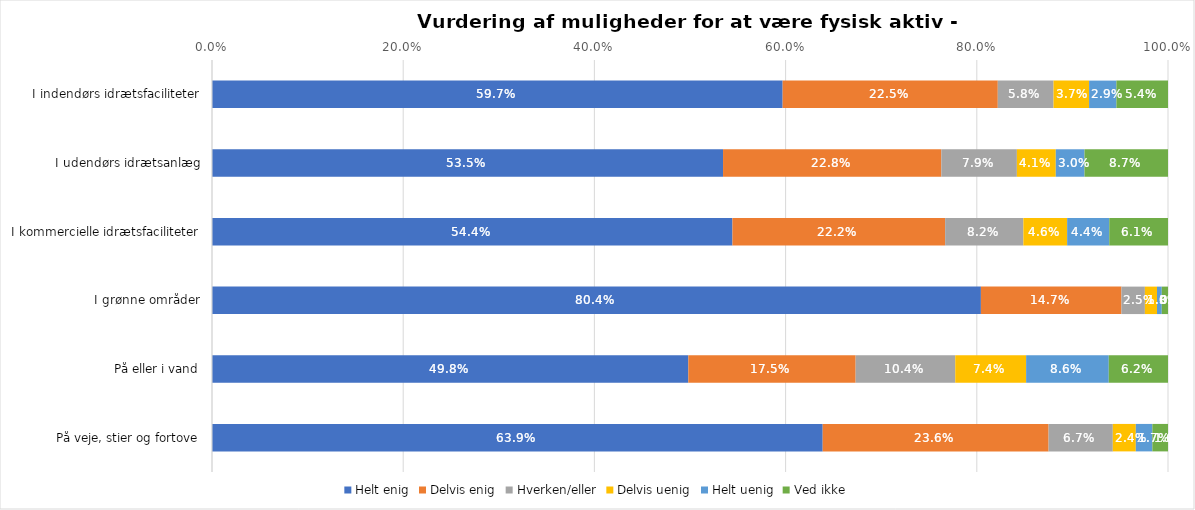
| Category | Helt enig | Delvis enig | Hverken/eller | Delvis uenig | Helt uenig | Ved ikke |
|---|---|---|---|---|---|---|
| I indendørs idrætsfaciliteter | 0.597 | 0.225 | 0.058 | 0.037 | 0.029 | 0.054 |
| I udendørs idrætsanlæg | 0.535 | 0.228 | 0.079 | 0.041 | 0.03 | 0.087 |
| I kommercielle idrætsfaciliteter | 0.544 | 0.222 | 0.082 | 0.046 | 0.044 | 0.061 |
| I grønne områder | 0.804 | 0.147 | 0.025 | 0.013 | 0.005 | 0.007 |
| På eller i vand | 0.498 | 0.175 | 0.104 | 0.074 | 0.086 | 0.062 |
| På veje, stier og fortove | 0.639 | 0.236 | 0.067 | 0.024 | 0.017 | 0.016 |